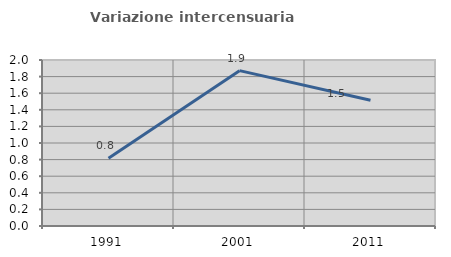
| Category | Variazione intercensuaria annua |
|---|---|
| 1991.0 | 0.817 |
| 2001.0 | 1.872 |
| 2011.0 | 1.514 |